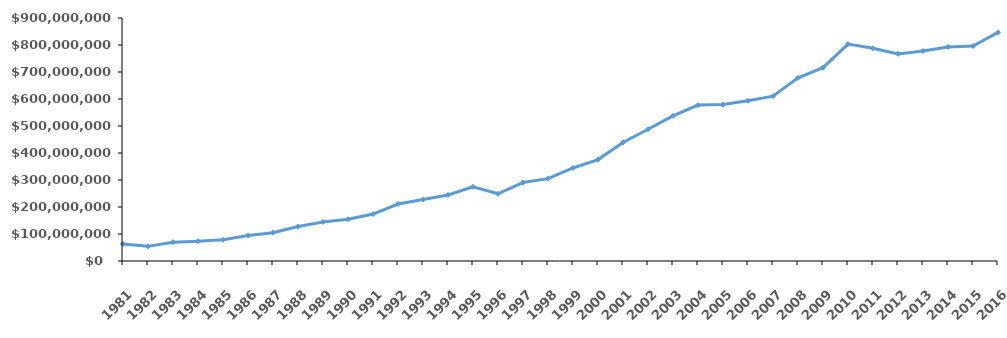
| Category | Total Awards |
|---|---|
| 1981.0 | 63028212 |
| 1982.0 | 54236859 |
| 1983.0 | 69750347 |
| 1984.0 | 73362531 |
| 1985.0 | 78633902 |
| 1986.0 | 94607443 |
| 1987.0 | 104919328 |
| 1988.0 | 127571460 |
| 1989.0 | 144505374 |
| 1990.0 | 154638815 |
| 1991.0 | 173938618 |
| 1992.0 | 211104491 |
| 1993.0 | 227589028 |
| 1994.0 | 244592943 |
| 1995.0 | 274884634 |
| 1996.0 | 248997990 |
| 1997.0 | 290650158 |
| 1998.0 | 304953768 |
| 1999.0 | 344496859 |
| 2000.0 | 375570798 |
| 2001.0 | 438780503 |
| 2002.0 | 487906010 |
| 2003.0 | 537415870 |
| 2004.0 | 577577064 |
| 2005.0 | 579589394 |
| 2006.0 | 593390527 |
| 2007.0 | 610669824 |
| 2008.0 | 678228055 |
| 2009.0 | 716274113 |
| 2010.0 | 803358125 |
| 2011.0 | 788025111 |
| 2012.0 | 767141341 |
| 2013.0 | 777838266 |
| 2014.0 | 792729006 |
| 2015.0 | 796171469 |
| 2016.0 | 846680025 |